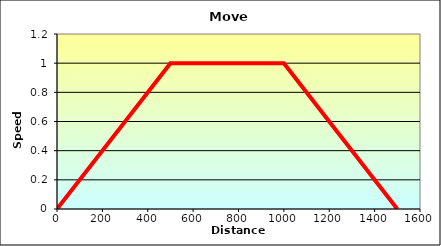
| Category | Series 0 |
|---|---|
| 0.0 | 0 |
| 500.0 | 1 |
| 1000.0 | 1 |
| 1500.0 | 0 |